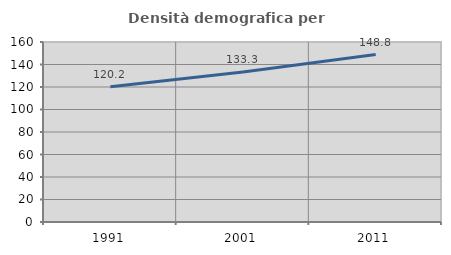
| Category | Densità demografica |
|---|---|
| 1991.0 | 120.23 |
| 2001.0 | 133.284 |
| 2011.0 | 148.811 |